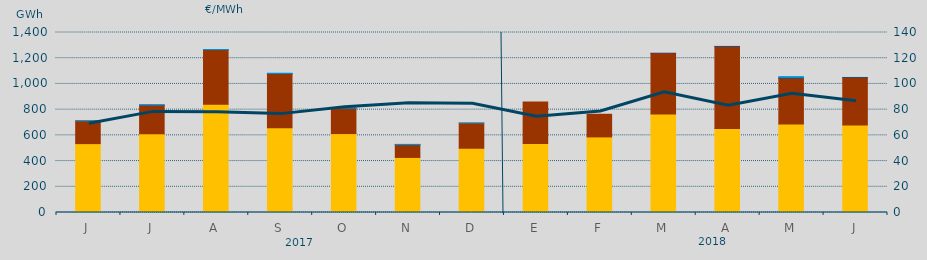
| Category | Ciclo Combinado | Carbón | Consumo Bombeo | Hidráulica | Otras Renovables |
|---|---|---|---|---|---|
| J | 535700.2 | 176734.4 | 0 | 240 | 0 |
| J | 612390.3 | 221645.5 | 1709.9 | 245 | 0 |
| A | 842008.2 | 424631 | 227.4 | 714.3 | 0 |
| S | 659557.1 | 419522.2 | 2247.5 | 1903.2 | 0 |
| O | 613794.4 | 195163.5 | 2877.8 | 1865.1 | 0 |
| N | 428275.6 | 99779.8 | 370 | 1458.4 | 0 |
| D | 499810.1 | 195559 | 0 | 237.7 | 0 |
| E | 535924.4 | 323414.2 | 0 | 0 | 0 |
| F | 587965.4 | 176086.6 | 0 | 0 | 0 |
| M | 766935.8 | 469679.3 | 0 | 790 | 1096.8 |
| A | 653437.2 | 637382 | 1000 | 0 | 0 |
| M | 688216.9 | 356322 | 5321 | 6699 | 0 |
| J | 680942.3 | 368722 | 583.4 | 0 | 0 |